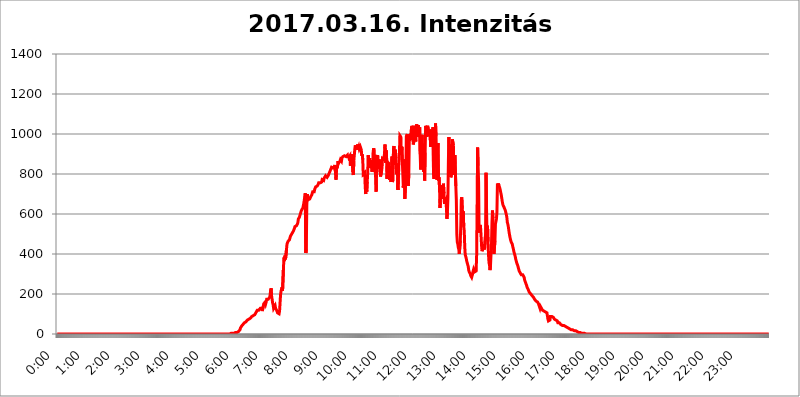
| Category | 2017.03.16. Intenzitás [W/m^2] |
|---|---|
| 0.0 | 0 |
| 0.0006944444444444445 | 0 |
| 0.001388888888888889 | 0 |
| 0.0020833333333333333 | 0 |
| 0.002777777777777778 | 0 |
| 0.003472222222222222 | 0 |
| 0.004166666666666667 | 0 |
| 0.004861111111111111 | 0 |
| 0.005555555555555556 | 0 |
| 0.0062499999999999995 | 0 |
| 0.006944444444444444 | 0 |
| 0.007638888888888889 | 0 |
| 0.008333333333333333 | 0 |
| 0.009027777777777779 | 0 |
| 0.009722222222222222 | 0 |
| 0.010416666666666666 | 0 |
| 0.011111111111111112 | 0 |
| 0.011805555555555555 | 0 |
| 0.012499999999999999 | 0 |
| 0.013194444444444444 | 0 |
| 0.013888888888888888 | 0 |
| 0.014583333333333332 | 0 |
| 0.015277777777777777 | 0 |
| 0.015972222222222224 | 0 |
| 0.016666666666666666 | 0 |
| 0.017361111111111112 | 0 |
| 0.018055555555555557 | 0 |
| 0.01875 | 0 |
| 0.019444444444444445 | 0 |
| 0.02013888888888889 | 0 |
| 0.020833333333333332 | 0 |
| 0.02152777777777778 | 0 |
| 0.022222222222222223 | 0 |
| 0.02291666666666667 | 0 |
| 0.02361111111111111 | 0 |
| 0.024305555555555556 | 0 |
| 0.024999999999999998 | 0 |
| 0.025694444444444447 | 0 |
| 0.02638888888888889 | 0 |
| 0.027083333333333334 | 0 |
| 0.027777777777777776 | 0 |
| 0.02847222222222222 | 0 |
| 0.029166666666666664 | 0 |
| 0.029861111111111113 | 0 |
| 0.030555555555555555 | 0 |
| 0.03125 | 0 |
| 0.03194444444444445 | 0 |
| 0.03263888888888889 | 0 |
| 0.03333333333333333 | 0 |
| 0.034027777777777775 | 0 |
| 0.034722222222222224 | 0 |
| 0.035416666666666666 | 0 |
| 0.036111111111111115 | 0 |
| 0.03680555555555556 | 0 |
| 0.0375 | 0 |
| 0.03819444444444444 | 0 |
| 0.03888888888888889 | 0 |
| 0.03958333333333333 | 0 |
| 0.04027777777777778 | 0 |
| 0.04097222222222222 | 0 |
| 0.041666666666666664 | 0 |
| 0.042361111111111106 | 0 |
| 0.04305555555555556 | 0 |
| 0.043750000000000004 | 0 |
| 0.044444444444444446 | 0 |
| 0.04513888888888889 | 0 |
| 0.04583333333333334 | 0 |
| 0.04652777777777778 | 0 |
| 0.04722222222222222 | 0 |
| 0.04791666666666666 | 0 |
| 0.04861111111111111 | 0 |
| 0.049305555555555554 | 0 |
| 0.049999999999999996 | 0 |
| 0.05069444444444445 | 0 |
| 0.051388888888888894 | 0 |
| 0.052083333333333336 | 0 |
| 0.05277777777777778 | 0 |
| 0.05347222222222222 | 0 |
| 0.05416666666666667 | 0 |
| 0.05486111111111111 | 0 |
| 0.05555555555555555 | 0 |
| 0.05625 | 0 |
| 0.05694444444444444 | 0 |
| 0.057638888888888885 | 0 |
| 0.05833333333333333 | 0 |
| 0.05902777777777778 | 0 |
| 0.059722222222222225 | 0 |
| 0.06041666666666667 | 0 |
| 0.061111111111111116 | 0 |
| 0.06180555555555556 | 0 |
| 0.0625 | 0 |
| 0.06319444444444444 | 0 |
| 0.06388888888888888 | 0 |
| 0.06458333333333334 | 0 |
| 0.06527777777777778 | 0 |
| 0.06597222222222222 | 0 |
| 0.06666666666666667 | 0 |
| 0.06736111111111111 | 0 |
| 0.06805555555555555 | 0 |
| 0.06874999999999999 | 0 |
| 0.06944444444444443 | 0 |
| 0.07013888888888889 | 0 |
| 0.07083333333333333 | 0 |
| 0.07152777777777779 | 0 |
| 0.07222222222222223 | 0 |
| 0.07291666666666667 | 0 |
| 0.07361111111111111 | 0 |
| 0.07430555555555556 | 0 |
| 0.075 | 0 |
| 0.07569444444444444 | 0 |
| 0.0763888888888889 | 0 |
| 0.07708333333333334 | 0 |
| 0.07777777777777778 | 0 |
| 0.07847222222222222 | 0 |
| 0.07916666666666666 | 0 |
| 0.0798611111111111 | 0 |
| 0.08055555555555556 | 0 |
| 0.08125 | 0 |
| 0.08194444444444444 | 0 |
| 0.08263888888888889 | 0 |
| 0.08333333333333333 | 0 |
| 0.08402777777777777 | 0 |
| 0.08472222222222221 | 0 |
| 0.08541666666666665 | 0 |
| 0.08611111111111112 | 0 |
| 0.08680555555555557 | 0 |
| 0.08750000000000001 | 0 |
| 0.08819444444444445 | 0 |
| 0.08888888888888889 | 0 |
| 0.08958333333333333 | 0 |
| 0.09027777777777778 | 0 |
| 0.09097222222222222 | 0 |
| 0.09166666666666667 | 0 |
| 0.09236111111111112 | 0 |
| 0.09305555555555556 | 0 |
| 0.09375 | 0 |
| 0.09444444444444444 | 0 |
| 0.09513888888888888 | 0 |
| 0.09583333333333333 | 0 |
| 0.09652777777777777 | 0 |
| 0.09722222222222222 | 0 |
| 0.09791666666666667 | 0 |
| 0.09861111111111111 | 0 |
| 0.09930555555555555 | 0 |
| 0.09999999999999999 | 0 |
| 0.10069444444444443 | 0 |
| 0.1013888888888889 | 0 |
| 0.10208333333333335 | 0 |
| 0.10277777777777779 | 0 |
| 0.10347222222222223 | 0 |
| 0.10416666666666667 | 0 |
| 0.10486111111111111 | 0 |
| 0.10555555555555556 | 0 |
| 0.10625 | 0 |
| 0.10694444444444444 | 0 |
| 0.1076388888888889 | 0 |
| 0.10833333333333334 | 0 |
| 0.10902777777777778 | 0 |
| 0.10972222222222222 | 0 |
| 0.1111111111111111 | 0 |
| 0.11180555555555556 | 0 |
| 0.11180555555555556 | 0 |
| 0.1125 | 0 |
| 0.11319444444444444 | 0 |
| 0.11388888888888889 | 0 |
| 0.11458333333333333 | 0 |
| 0.11527777777777777 | 0 |
| 0.11597222222222221 | 0 |
| 0.11666666666666665 | 0 |
| 0.1173611111111111 | 0 |
| 0.11805555555555557 | 0 |
| 0.11944444444444445 | 0 |
| 0.12013888888888889 | 0 |
| 0.12083333333333333 | 0 |
| 0.12152777777777778 | 0 |
| 0.12222222222222223 | 0 |
| 0.12291666666666667 | 0 |
| 0.12291666666666667 | 0 |
| 0.12361111111111112 | 0 |
| 0.12430555555555556 | 0 |
| 0.125 | 0 |
| 0.12569444444444444 | 0 |
| 0.12638888888888888 | 0 |
| 0.12708333333333333 | 0 |
| 0.16875 | 0 |
| 0.12847222222222224 | 0 |
| 0.12916666666666668 | 0 |
| 0.12986111111111112 | 0 |
| 0.13055555555555556 | 0 |
| 0.13125 | 0 |
| 0.13194444444444445 | 0 |
| 0.1326388888888889 | 0 |
| 0.13333333333333333 | 0 |
| 0.13402777777777777 | 0 |
| 0.13402777777777777 | 0 |
| 0.13472222222222222 | 0 |
| 0.13541666666666666 | 0 |
| 0.1361111111111111 | 0 |
| 0.13749999999999998 | 0 |
| 0.13819444444444443 | 0 |
| 0.1388888888888889 | 0 |
| 0.13958333333333334 | 0 |
| 0.14027777777777778 | 0 |
| 0.14097222222222222 | 0 |
| 0.14166666666666666 | 0 |
| 0.1423611111111111 | 0 |
| 0.14305555555555557 | 0 |
| 0.14375000000000002 | 0 |
| 0.14444444444444446 | 0 |
| 0.1451388888888889 | 0 |
| 0.1451388888888889 | 0 |
| 0.14652777777777778 | 0 |
| 0.14722222222222223 | 0 |
| 0.14791666666666667 | 0 |
| 0.1486111111111111 | 0 |
| 0.14930555555555555 | 0 |
| 0.15 | 0 |
| 0.15069444444444444 | 0 |
| 0.15138888888888888 | 0 |
| 0.15208333333333332 | 0 |
| 0.15277777777777776 | 0 |
| 0.15347222222222223 | 0 |
| 0.15416666666666667 | 0 |
| 0.15486111111111112 | 0 |
| 0.15555555555555556 | 0 |
| 0.15625 | 0 |
| 0.15694444444444444 | 0 |
| 0.15763888888888888 | 0 |
| 0.15833333333333333 | 0 |
| 0.15902777777777777 | 0 |
| 0.15972222222222224 | 0 |
| 0.16041666666666668 | 0 |
| 0.16111111111111112 | 0 |
| 0.16180555555555556 | 0 |
| 0.1625 | 0 |
| 0.16319444444444445 | 0 |
| 0.1638888888888889 | 0 |
| 0.16458333333333333 | 0 |
| 0.16527777777777777 | 0 |
| 0.16597222222222222 | 0 |
| 0.16666666666666666 | 0 |
| 0.1673611111111111 | 0 |
| 0.16805555555555554 | 0 |
| 0.16874999999999998 | 0 |
| 0.16944444444444443 | 0 |
| 0.17013888888888887 | 0 |
| 0.1708333333333333 | 0 |
| 0.17152777777777775 | 0 |
| 0.17222222222222225 | 0 |
| 0.1729166666666667 | 0 |
| 0.17361111111111113 | 0 |
| 0.17430555555555557 | 0 |
| 0.17500000000000002 | 0 |
| 0.17569444444444446 | 0 |
| 0.1763888888888889 | 0 |
| 0.17708333333333334 | 0 |
| 0.17777777777777778 | 0 |
| 0.17847222222222223 | 0 |
| 0.17916666666666667 | 0 |
| 0.1798611111111111 | 0 |
| 0.18055555555555555 | 0 |
| 0.18125 | 0 |
| 0.18194444444444444 | 0 |
| 0.1826388888888889 | 0 |
| 0.18333333333333335 | 0 |
| 0.1840277777777778 | 0 |
| 0.18472222222222223 | 0 |
| 0.18541666666666667 | 0 |
| 0.18611111111111112 | 0 |
| 0.18680555555555556 | 0 |
| 0.1875 | 0 |
| 0.18819444444444444 | 0 |
| 0.18888888888888888 | 0 |
| 0.18958333333333333 | 0 |
| 0.19027777777777777 | 0 |
| 0.1909722222222222 | 0 |
| 0.19166666666666665 | 0 |
| 0.19236111111111112 | 0 |
| 0.19305555555555554 | 0 |
| 0.19375 | 0 |
| 0.19444444444444445 | 0 |
| 0.1951388888888889 | 0 |
| 0.19583333333333333 | 0 |
| 0.19652777777777777 | 0 |
| 0.19722222222222222 | 0 |
| 0.19791666666666666 | 0 |
| 0.1986111111111111 | 0 |
| 0.19930555555555554 | 0 |
| 0.19999999999999998 | 0 |
| 0.20069444444444443 | 0 |
| 0.20138888888888887 | 0 |
| 0.2020833333333333 | 0 |
| 0.2027777777777778 | 0 |
| 0.2034722222222222 | 0 |
| 0.2041666666666667 | 0 |
| 0.20486111111111113 | 0 |
| 0.20555555555555557 | 0 |
| 0.20625000000000002 | 0 |
| 0.20694444444444446 | 0 |
| 0.2076388888888889 | 0 |
| 0.20833333333333334 | 0 |
| 0.20902777777777778 | 0 |
| 0.20972222222222223 | 0 |
| 0.21041666666666667 | 0 |
| 0.2111111111111111 | 0 |
| 0.21180555555555555 | 0 |
| 0.2125 | 0 |
| 0.21319444444444444 | 0 |
| 0.2138888888888889 | 0 |
| 0.21458333333333335 | 0 |
| 0.2152777777777778 | 0 |
| 0.21597222222222223 | 0 |
| 0.21666666666666667 | 0 |
| 0.21736111111111112 | 0 |
| 0.21805555555555556 | 0 |
| 0.21875 | 0 |
| 0.21944444444444444 | 0 |
| 0.22013888888888888 | 0 |
| 0.22083333333333333 | 0 |
| 0.22152777777777777 | 0 |
| 0.2222222222222222 | 0 |
| 0.22291666666666665 | 0 |
| 0.2236111111111111 | 0 |
| 0.22430555555555556 | 0 |
| 0.225 | 0 |
| 0.22569444444444445 | 0 |
| 0.2263888888888889 | 0 |
| 0.22708333333333333 | 0 |
| 0.22777777777777777 | 0 |
| 0.22847222222222222 | 0 |
| 0.22916666666666666 | 0 |
| 0.2298611111111111 | 0 |
| 0.23055555555555554 | 0 |
| 0.23124999999999998 | 0 |
| 0.23194444444444443 | 0 |
| 0.23263888888888887 | 0 |
| 0.2333333333333333 | 0 |
| 0.2340277777777778 | 0 |
| 0.2347222222222222 | 0 |
| 0.2354166666666667 | 0 |
| 0.23611111111111113 | 0 |
| 0.23680555555555557 | 0 |
| 0.23750000000000002 | 0 |
| 0.23819444444444446 | 0 |
| 0.2388888888888889 | 0 |
| 0.23958333333333334 | 0 |
| 0.24027777777777778 | 0 |
| 0.24097222222222223 | 0 |
| 0.24166666666666667 | 0 |
| 0.2423611111111111 | 0 |
| 0.24305555555555555 | 0 |
| 0.24375 | 3.525 |
| 0.24444444444444446 | 3.525 |
| 0.24513888888888888 | 3.525 |
| 0.24583333333333335 | 3.525 |
| 0.2465277777777778 | 3.525 |
| 0.24722222222222223 | 3.525 |
| 0.24791666666666667 | 3.525 |
| 0.24861111111111112 | 3.525 |
| 0.24930555555555556 | 3.525 |
| 0.25 | 7.887 |
| 0.25069444444444444 | 7.887 |
| 0.2513888888888889 | 7.887 |
| 0.2520833333333333 | 7.887 |
| 0.25277777777777777 | 7.887 |
| 0.2534722222222222 | 12.257 |
| 0.25416666666666665 | 12.257 |
| 0.2548611111111111 | 12.257 |
| 0.2555555555555556 | 16.636 |
| 0.25625000000000003 | 21.024 |
| 0.2569444444444445 | 29.823 |
| 0.2576388888888889 | 34.234 |
| 0.25833333333333336 | 38.653 |
| 0.2590277777777778 | 43.079 |
| 0.25972222222222224 | 43.079 |
| 0.2604166666666667 | 47.511 |
| 0.2611111111111111 | 47.511 |
| 0.26180555555555557 | 51.951 |
| 0.2625 | 56.398 |
| 0.26319444444444445 | 56.398 |
| 0.2638888888888889 | 60.85 |
| 0.26458333333333334 | 60.85 |
| 0.2652777777777778 | 65.31 |
| 0.2659722222222222 | 65.31 |
| 0.26666666666666666 | 69.775 |
| 0.2673611111111111 | 69.775 |
| 0.26805555555555555 | 69.775 |
| 0.26875 | 74.246 |
| 0.26944444444444443 | 74.246 |
| 0.2701388888888889 | 74.246 |
| 0.2708333333333333 | 78.722 |
| 0.27152777777777776 | 83.205 |
| 0.2722222222222222 | 83.205 |
| 0.27291666666666664 | 87.692 |
| 0.2736111111111111 | 87.692 |
| 0.2743055555555555 | 87.692 |
| 0.27499999999999997 | 92.184 |
| 0.27569444444444446 | 92.184 |
| 0.27638888888888885 | 92.184 |
| 0.27708333333333335 | 96.682 |
| 0.2777777777777778 | 101.184 |
| 0.27847222222222223 | 105.69 |
| 0.2791666666666667 | 110.201 |
| 0.2798611111111111 | 110.201 |
| 0.28055555555555556 | 119.235 |
| 0.28125 | 119.235 |
| 0.28194444444444444 | 119.235 |
| 0.2826388888888889 | 119.235 |
| 0.2833333333333333 | 123.758 |
| 0.28402777777777777 | 123.758 |
| 0.2847222222222222 | 128.284 |
| 0.28541666666666665 | 128.284 |
| 0.28611111111111115 | 132.814 |
| 0.28680555555555554 | 128.284 |
| 0.28750000000000003 | 114.716 |
| 0.2881944444444445 | 114.716 |
| 0.2888888888888889 | 137.347 |
| 0.28958333333333336 | 150.964 |
| 0.2902777777777778 | 150.964 |
| 0.29097222222222224 | 146.423 |
| 0.2916666666666667 | 160.056 |
| 0.2923611111111111 | 150.964 |
| 0.29305555555555557 | 160.056 |
| 0.29375 | 173.709 |
| 0.29444444444444445 | 178.264 |
| 0.2951388888888889 | 173.709 |
| 0.29583333333333334 | 173.709 |
| 0.2965277777777778 | 178.264 |
| 0.2972222222222222 | 178.264 |
| 0.29791666666666666 | 182.82 |
| 0.2986111111111111 | 196.497 |
| 0.29930555555555555 | 219.309 |
| 0.3 | 228.436 |
| 0.30069444444444443 | 187.378 |
| 0.3013888888888889 | 173.709 |
| 0.3020833333333333 | 155.509 |
| 0.30277777777777776 | 146.423 |
| 0.3034722222222222 | 128.284 |
| 0.30416666666666664 | 128.284 |
| 0.3048611111111111 | 132.814 |
| 0.3055555555555555 | 141.884 |
| 0.30624999999999997 | 128.284 |
| 0.3069444444444444 | 132.814 |
| 0.3076388888888889 | 119.235 |
| 0.30833333333333335 | 114.716 |
| 0.3090277777777778 | 105.69 |
| 0.30972222222222223 | 101.184 |
| 0.3104166666666667 | 101.184 |
| 0.3111111111111111 | 101.184 |
| 0.31180555555555556 | 114.716 |
| 0.3125 | 119.235 |
| 0.31319444444444444 | 196.497 |
| 0.3138888888888889 | 214.746 |
| 0.3145833333333333 | 214.746 |
| 0.31527777777777777 | 233 |
| 0.3159722222222222 | 214.746 |
| 0.31666666666666665 | 210.182 |
| 0.31736111111111115 | 337.639 |
| 0.31805555555555554 | 382.715 |
| 0.31875000000000003 | 364.728 |
| 0.3194444444444445 | 391.685 |
| 0.3201388888888889 | 373.729 |
| 0.32083333333333336 | 378.224 |
| 0.3215277777777778 | 422.943 |
| 0.32222222222222224 | 449.551 |
| 0.3229166666666667 | 453.968 |
| 0.3236111111111111 | 462.786 |
| 0.32430555555555557 | 462.786 |
| 0.325 | 462.786 |
| 0.32569444444444445 | 471.582 |
| 0.3263888888888889 | 480.356 |
| 0.32708333333333334 | 489.108 |
| 0.3277777777777778 | 484.735 |
| 0.3284722222222222 | 497.836 |
| 0.32916666666666666 | 497.836 |
| 0.3298611111111111 | 506.542 |
| 0.33055555555555555 | 510.885 |
| 0.33125 | 515.223 |
| 0.33194444444444443 | 519.555 |
| 0.3326388888888889 | 528.2 |
| 0.3333333333333333 | 536.82 |
| 0.3340277777777778 | 532.513 |
| 0.3347222222222222 | 541.121 |
| 0.3354166666666667 | 541.121 |
| 0.3361111111111111 | 545.416 |
| 0.3368055555555556 | 549.704 |
| 0.33749999999999997 | 558.261 |
| 0.33819444444444446 | 575.299 |
| 0.33888888888888885 | 579.542 |
| 0.33958333333333335 | 583.779 |
| 0.34027777777777773 | 592.233 |
| 0.34097222222222223 | 600.661 |
| 0.3416666666666666 | 609.062 |
| 0.3423611111111111 | 617.436 |
| 0.3430555555555555 | 617.436 |
| 0.34375 | 617.436 |
| 0.3444444444444445 | 629.948 |
| 0.3451388888888889 | 634.105 |
| 0.3458333333333334 | 654.791 |
| 0.34652777777777777 | 671.22 |
| 0.34722222222222227 | 687.544 |
| 0.34791666666666665 | 703.762 |
| 0.34861111111111115 | 405.108 |
| 0.34930555555555554 | 422.943 |
| 0.35000000000000003 | 642.4 |
| 0.3506944444444444 | 699.717 |
| 0.3513888888888889 | 679.395 |
| 0.3520833333333333 | 671.22 |
| 0.3527777777777778 | 667.123 |
| 0.3534722222222222 | 675.311 |
| 0.3541666666666667 | 675.311 |
| 0.3548611111111111 | 679.395 |
| 0.35555555555555557 | 687.544 |
| 0.35625 | 691.608 |
| 0.35694444444444445 | 695.666 |
| 0.3576388888888889 | 699.717 |
| 0.35833333333333334 | 711.832 |
| 0.3590277777777778 | 715.858 |
| 0.3597222222222222 | 715.858 |
| 0.36041666666666666 | 711.832 |
| 0.3611111111111111 | 723.889 |
| 0.36180555555555555 | 727.896 |
| 0.3625 | 735.89 |
| 0.36319444444444443 | 735.89 |
| 0.3638888888888889 | 735.89 |
| 0.3645833333333333 | 739.877 |
| 0.3652777777777778 | 739.877 |
| 0.3659722222222222 | 747.834 |
| 0.3666666666666667 | 755.766 |
| 0.3673611111111111 | 759.723 |
| 0.3680555555555556 | 759.723 |
| 0.36874999999999997 | 755.766 |
| 0.36944444444444446 | 751.803 |
| 0.37013888888888885 | 755.766 |
| 0.37083333333333335 | 759.723 |
| 0.37152777777777773 | 771.559 |
| 0.37222222222222223 | 771.559 |
| 0.3729166666666666 | 771.559 |
| 0.3736111111111111 | 767.62 |
| 0.3743055555555555 | 779.42 |
| 0.375 | 779.42 |
| 0.3756944444444445 | 783.342 |
| 0.3763888888888889 | 791.169 |
| 0.3770833333333334 | 791.169 |
| 0.37777777777777777 | 791.169 |
| 0.37847222222222227 | 783.342 |
| 0.37916666666666665 | 787.258 |
| 0.37986111111111115 | 791.169 |
| 0.38055555555555554 | 795.074 |
| 0.38125000000000003 | 802.868 |
| 0.3819444444444444 | 802.868 |
| 0.3826388888888889 | 814.519 |
| 0.3833333333333333 | 814.519 |
| 0.3840277777777778 | 810.641 |
| 0.3847222222222222 | 833.834 |
| 0.3854166666666667 | 833.834 |
| 0.3861111111111111 | 837.682 |
| 0.38680555555555557 | 829.981 |
| 0.3875 | 833.834 |
| 0.38819444444444445 | 829.981 |
| 0.3888888888888889 | 837.682 |
| 0.38958333333333334 | 845.365 |
| 0.3902777777777778 | 802.868 |
| 0.3909722222222222 | 771.559 |
| 0.39166666666666666 | 826.123 |
| 0.3923611111111111 | 829.981 |
| 0.39305555555555555 | 833.834 |
| 0.39375 | 864.493 |
| 0.39444444444444443 | 853.029 |
| 0.3951388888888889 | 856.855 |
| 0.3958333333333333 | 856.855 |
| 0.3965277777777778 | 864.493 |
| 0.3972222222222222 | 872.114 |
| 0.3979166666666667 | 868.305 |
| 0.3986111111111111 | 864.493 |
| 0.3993055555555556 | 879.719 |
| 0.39999999999999997 | 883.516 |
| 0.40069444444444446 | 887.309 |
| 0.40138888888888885 | 891.099 |
| 0.40208333333333335 | 891.099 |
| 0.40277777777777773 | 891.099 |
| 0.40347222222222223 | 887.309 |
| 0.4041666666666666 | 891.099 |
| 0.4048611111111111 | 887.309 |
| 0.4055555555555555 | 887.309 |
| 0.40625 | 891.099 |
| 0.4069444444444445 | 894.885 |
| 0.4076388888888889 | 879.719 |
| 0.4083333333333334 | 894.885 |
| 0.40902777777777777 | 883.516 |
| 0.40972222222222227 | 887.309 |
| 0.41041666666666665 | 891.099 |
| 0.41111111111111115 | 841.526 |
| 0.41180555555555554 | 875.918 |
| 0.41250000000000003 | 887.309 |
| 0.4131944444444444 | 898.668 |
| 0.4138888888888889 | 898.668 |
| 0.4145833333333333 | 810.641 |
| 0.4152777777777778 | 795.074 |
| 0.4159722222222222 | 868.305 |
| 0.4166666666666667 | 894.885 |
| 0.4173611111111111 | 925.06 |
| 0.41805555555555557 | 943.832 |
| 0.41875 | 947.58 |
| 0.41944444444444445 | 928.819 |
| 0.4201388888888889 | 921.298 |
| 0.42083333333333334 | 925.06 |
| 0.4215277777777778 | 947.58 |
| 0.4222222222222222 | 928.819 |
| 0.42291666666666666 | 936.33 |
| 0.4236111111111111 | 925.06 |
| 0.42430555555555555 | 921.298 |
| 0.425 | 936.33 |
| 0.42569444444444443 | 940.082 |
| 0.4263888888888889 | 921.298 |
| 0.4270833333333333 | 891.099 |
| 0.4277777777777778 | 898.668 |
| 0.4284722222222222 | 872.114 |
| 0.4291666666666667 | 798.974 |
| 0.4298611111111111 | 795.074 |
| 0.4305555555555556 | 798.974 |
| 0.43124999999999997 | 806.757 |
| 0.43194444444444446 | 735.89 |
| 0.43263888888888885 | 699.717 |
| 0.43333333333333335 | 763.674 |
| 0.43402777777777773 | 711.832 |
| 0.43472222222222223 | 759.723 |
| 0.4354166666666666 | 802.868 |
| 0.4361111111111111 | 894.885 |
| 0.4368055555555555 | 864.493 |
| 0.4375 | 853.029 |
| 0.4381944444444445 | 879.719 |
| 0.4388888888888889 | 849.199 |
| 0.4395833333333334 | 829.981 |
| 0.44027777777777777 | 868.305 |
| 0.44097222222222227 | 868.305 |
| 0.44166666666666665 | 810.641 |
| 0.44236111111111115 | 833.834 |
| 0.44305555555555554 | 909.996 |
| 0.44375000000000003 | 928.819 |
| 0.4444444444444444 | 913.766 |
| 0.4451388888888889 | 879.719 |
| 0.4458333333333333 | 826.123 |
| 0.4465277777777778 | 783.342 |
| 0.4472222222222222 | 711.832 |
| 0.4479166666666667 | 845.365 |
| 0.4486111111111111 | 887.309 |
| 0.44930555555555557 | 894.885 |
| 0.45 | 845.365 |
| 0.45069444444444445 | 826.123 |
| 0.4513888888888889 | 826.123 |
| 0.45208333333333334 | 872.114 |
| 0.4527777777777778 | 810.641 |
| 0.4534722222222222 | 787.258 |
| 0.45416666666666666 | 787.258 |
| 0.4548611111111111 | 814.519 |
| 0.45555555555555555 | 833.834 |
| 0.45625 | 879.719 |
| 0.45694444444444443 | 875.918 |
| 0.4576388888888889 | 875.918 |
| 0.4583333333333333 | 875.918 |
| 0.4590277777777778 | 906.223 |
| 0.4597222222222222 | 947.58 |
| 0.4604166666666667 | 856.855 |
| 0.4611111111111111 | 917.534 |
| 0.4618055555555556 | 909.996 |
| 0.46249999999999997 | 775.492 |
| 0.46319444444444446 | 860.676 |
| 0.46388888888888885 | 860.676 |
| 0.46458333333333335 | 856.855 |
| 0.46527777777777773 | 853.029 |
| 0.46597222222222223 | 771.559 |
| 0.4666666666666666 | 814.519 |
| 0.4673611111111111 | 798.974 |
| 0.4680555555555555 | 759.723 |
| 0.46875 | 818.392 |
| 0.4694444444444445 | 887.309 |
| 0.4701388888888889 | 759.723 |
| 0.4708333333333334 | 771.559 |
| 0.47152777777777777 | 921.298 |
| 0.47222222222222227 | 940.082 |
| 0.47291666666666665 | 891.099 |
| 0.47361111111111115 | 845.365 |
| 0.47430555555555554 | 921.298 |
| 0.47500000000000003 | 879.719 |
| 0.4756944444444444 | 798.974 |
| 0.4763888888888889 | 841.526 |
| 0.4770833333333333 | 853.029 |
| 0.4777777777777778 | 719.877 |
| 0.4784722222222222 | 783.342 |
| 0.4791666666666667 | 845.365 |
| 0.4798611111111111 | 894.885 |
| 0.48055555555555557 | 992.448 |
| 0.48125 | 988.714 |
| 0.48194444444444445 | 984.98 |
| 0.4826388888888889 | 898.668 |
| 0.48333333333333334 | 936.33 |
| 0.4840277777777778 | 860.676 |
| 0.4847222222222222 | 860.676 |
| 0.48541666666666666 | 731.896 |
| 0.4861111111111111 | 872.114 |
| 0.48680555555555555 | 775.492 |
| 0.4875 | 675.311 |
| 0.48819444444444443 | 675.311 |
| 0.4888888888888889 | 775.492 |
| 0.4895833333333333 | 988.714 |
| 0.4902777777777778 | 988.714 |
| 0.4909722222222222 | 999.916 |
| 0.4916666666666667 | 925.06 |
| 0.4923611111111111 | 739.877 |
| 0.4930555555555556 | 798.974 |
| 0.49374999999999997 | 973.772 |
| 0.49444444444444446 | 966.295 |
| 0.49513888888888885 | 999.916 |
| 0.49583333333333335 | 970.034 |
| 0.49652777777777773 | 1018.587 |
| 0.49722222222222223 | 1041.019 |
| 0.4979166666666666 | 1033.537 |
| 0.4986111111111111 | 996.182 |
| 0.4993055555555555 | 947.58 |
| 0.5 | 958.814 |
| 0.5006944444444444 | 1029.798 |
| 0.5013888888888889 | 1041.019 |
| 0.5020833333333333 | 1007.383 |
| 0.5027777777777778 | 962.555 |
| 0.5034722222222222 | 1037.277 |
| 0.5041666666666667 | 1048.508 |
| 0.5048611111111111 | 1052.255 |
| 0.5055555555555555 | 992.448 |
| 0.50625 | 1044.762 |
| 0.5069444444444444 | 984.98 |
| 0.5076388888888889 | 1018.587 |
| 0.5083333333333333 | 1033.537 |
| 0.5090277777777777 | 898.668 |
| 0.5097222222222222 | 822.26 |
| 0.5104166666666666 | 943.832 |
| 0.5111111111111112 | 977.508 |
| 0.5118055555555555 | 996.182 |
| 0.5125000000000001 | 891.099 |
| 0.5131944444444444 | 951.327 |
| 0.513888888888889 | 810.641 |
| 0.5145833333333333 | 887.309 |
| 0.5152777777777778 | 767.62 |
| 0.5159722222222222 | 906.223 |
| 0.5166666666666667 | 1041.019 |
| 0.517361111111111 | 1029.798 |
| 0.5180555555555556 | 984.98 |
| 0.5187499999999999 | 1029.798 |
| 0.5194444444444445 | 1041.019 |
| 0.5201388888888888 | 1037.277 |
| 0.5208333333333334 | 1014.852 |
| 0.5215277777777778 | 1011.118 |
| 0.5222222222222223 | 988.714 |
| 0.5229166666666667 | 1014.852 |
| 0.5236111111111111 | 936.33 |
| 0.5243055555555556 | 1014.852 |
| 0.525 | 1022.323 |
| 0.5256944444444445 | 984.98 |
| 0.5263888888888889 | 962.555 |
| 0.5270833333333333 | 1033.537 |
| 0.5277777777777778 | 798.974 |
| 0.5284722222222222 | 775.492 |
| 0.5291666666666667 | 928.819 |
| 0.5298611111111111 | 833.834 |
| 0.5305555555555556 | 1052.255 |
| 0.53125 | 988.714 |
| 0.5319444444444444 | 887.309 |
| 0.5326388888888889 | 771.559 |
| 0.5333333333333333 | 917.534 |
| 0.5340277777777778 | 955.071 |
| 0.5347222222222222 | 767.62 |
| 0.5354166666666667 | 783.342 |
| 0.5361111111111111 | 735.89 |
| 0.5368055555555555 | 629.948 |
| 0.5375 | 629.948 |
| 0.5381944444444444 | 743.859 |
| 0.5388888888888889 | 679.395 |
| 0.5395833333333333 | 699.717 |
| 0.5402777777777777 | 675.311 |
| 0.5409722222222222 | 719.877 |
| 0.5416666666666666 | 751.803 |
| 0.5423611111111112 | 703.762 |
| 0.5430555555555555 | 650.667 |
| 0.5437500000000001 | 667.123 |
| 0.5444444444444444 | 663.019 |
| 0.545138888888889 | 675.311 |
| 0.5458333333333333 | 629.948 |
| 0.5465277777777778 | 575.299 |
| 0.5472222222222222 | 609.062 |
| 0.5479166666666667 | 679.395 |
| 0.548611111111111 | 868.305 |
| 0.5493055555555556 | 984.98 |
| 0.5499999999999999 | 798.974 |
| 0.5506944444444445 | 947.58 |
| 0.5513888888888888 | 909.996 |
| 0.5520833333333334 | 783.342 |
| 0.5527777777777778 | 795.074 |
| 0.5534722222222223 | 917.534 |
| 0.5541666666666667 | 973.772 |
| 0.5548611111111111 | 973.772 |
| 0.5555555555555556 | 943.832 |
| 0.55625 | 829.981 |
| 0.5569444444444445 | 795.074 |
| 0.5576388888888889 | 894.885 |
| 0.5583333333333333 | 894.885 |
| 0.5590277777777778 | 739.877 |
| 0.5597222222222222 | 671.22 |
| 0.5604166666666667 | 497.836 |
| 0.5611111111111111 | 458.38 |
| 0.5618055555555556 | 449.551 |
| 0.5625 | 431.833 |
| 0.5631944444444444 | 422.943 |
| 0.5638888888888889 | 400.638 |
| 0.5645833333333333 | 400.638 |
| 0.5652777777777778 | 467.187 |
| 0.5659722222222222 | 541.121 |
| 0.5666666666666667 | 671.22 |
| 0.5673611111111111 | 683.473 |
| 0.5680555555555555 | 625.784 |
| 0.56875 | 604.864 |
| 0.5694444444444444 | 613.252 |
| 0.5701388888888889 | 536.82 |
| 0.5708333333333333 | 515.223 |
| 0.5715277777777777 | 436.27 |
| 0.5722222222222222 | 396.164 |
| 0.5729166666666666 | 387.202 |
| 0.5736111111111112 | 378.224 |
| 0.5743055555555555 | 364.728 |
| 0.5750000000000001 | 355.712 |
| 0.5756944444444444 | 346.682 |
| 0.576388888888889 | 337.639 |
| 0.5770833333333333 | 319.517 |
| 0.5777777777777778 | 310.44 |
| 0.5784722222222222 | 305.898 |
| 0.5791666666666667 | 301.354 |
| 0.579861111111111 | 292.259 |
| 0.5805555555555556 | 287.709 |
| 0.5812499999999999 | 283.156 |
| 0.5819444444444445 | 287.709 |
| 0.5826388888888888 | 301.354 |
| 0.5833333333333334 | 314.98 |
| 0.5840277777777778 | 324.052 |
| 0.5847222222222223 | 319.517 |
| 0.5854166666666667 | 310.44 |
| 0.5861111111111111 | 305.898 |
| 0.5868055555555556 | 305.898 |
| 0.5875 | 314.98 |
| 0.5881944444444445 | 391.685 |
| 0.5888888888888889 | 646.537 |
| 0.5895833333333333 | 932.576 |
| 0.5902777777777778 | 841.526 |
| 0.5909722222222222 | 759.723 |
| 0.5916666666666667 | 506.542 |
| 0.5923611111111111 | 506.542 |
| 0.5930555555555556 | 545.416 |
| 0.59375 | 532.513 |
| 0.5944444444444444 | 489.108 |
| 0.5951388888888889 | 440.702 |
| 0.5958333333333333 | 414.035 |
| 0.5965277777777778 | 422.943 |
| 0.5972222222222222 | 422.943 |
| 0.5979166666666667 | 431.833 |
| 0.5986111111111111 | 449.551 |
| 0.5993055555555555 | 422.943 |
| 0.6 | 422.943 |
| 0.6006944444444444 | 497.836 |
| 0.6013888888888889 | 806.757 |
| 0.6020833333333333 | 625.784 |
| 0.6027777777777777 | 493.475 |
| 0.6034722222222222 | 541.121 |
| 0.6041666666666666 | 462.786 |
| 0.6048611111111112 | 396.164 |
| 0.6055555555555555 | 355.712 |
| 0.6062500000000001 | 346.682 |
| 0.6069444444444444 | 319.517 |
| 0.607638888888889 | 342.162 |
| 0.6083333333333333 | 396.164 |
| 0.6090277777777778 | 445.129 |
| 0.6097222222222222 | 558.261 |
| 0.6104166666666667 | 617.436 |
| 0.611111111111111 | 579.542 |
| 0.6118055555555556 | 431.833 |
| 0.6124999999999999 | 400.638 |
| 0.6131944444444445 | 396.164 |
| 0.6138888888888888 | 467.187 |
| 0.6145833333333334 | 549.704 |
| 0.6152777777777778 | 545.416 |
| 0.6159722222222223 | 575.299 |
| 0.6166666666666667 | 609.062 |
| 0.6173611111111111 | 751.803 |
| 0.6180555555555556 | 739.877 |
| 0.61875 | 751.803 |
| 0.6194444444444445 | 743.859 |
| 0.6201388888888889 | 739.877 |
| 0.6208333333333333 | 727.896 |
| 0.6215277777777778 | 715.858 |
| 0.6222222222222222 | 703.762 |
| 0.6229166666666667 | 691.608 |
| 0.6236111111111111 | 675.311 |
| 0.6243055555555556 | 658.909 |
| 0.625 | 646.537 |
| 0.6256944444444444 | 642.4 |
| 0.6263888888888889 | 642.4 |
| 0.6270833333333333 | 629.948 |
| 0.6277777777777778 | 629.948 |
| 0.6284722222222222 | 617.436 |
| 0.6291666666666667 | 617.436 |
| 0.6298611111111111 | 596.45 |
| 0.6305555555555555 | 583.779 |
| 0.63125 | 558.261 |
| 0.6319444444444444 | 549.704 |
| 0.6326388888888889 | 536.82 |
| 0.6333333333333333 | 519.555 |
| 0.6340277777777777 | 502.192 |
| 0.6347222222222222 | 489.108 |
| 0.6354166666666666 | 475.972 |
| 0.6361111111111112 | 467.187 |
| 0.6368055555555555 | 458.38 |
| 0.6375000000000001 | 453.968 |
| 0.6381944444444444 | 449.551 |
| 0.638888888888889 | 436.27 |
| 0.6395833333333333 | 427.39 |
| 0.6402777777777778 | 414.035 |
| 0.6409722222222222 | 405.108 |
| 0.6416666666666667 | 396.164 |
| 0.642361111111111 | 387.202 |
| 0.6430555555555556 | 373.729 |
| 0.6437499999999999 | 369.23 |
| 0.6444444444444445 | 355.712 |
| 0.6451388888888888 | 351.198 |
| 0.6458333333333334 | 342.162 |
| 0.6465277777777778 | 333.113 |
| 0.6472222222222223 | 324.052 |
| 0.6479166666666667 | 314.98 |
| 0.6486111111111111 | 310.44 |
| 0.6493055555555556 | 305.898 |
| 0.65 | 301.354 |
| 0.6506944444444445 | 296.808 |
| 0.6513888888888889 | 301.354 |
| 0.6520833333333333 | 296.808 |
| 0.6527777777777778 | 296.808 |
| 0.6534722222222222 | 296.808 |
| 0.6541666666666667 | 292.259 |
| 0.6548611111111111 | 283.156 |
| 0.6555555555555556 | 269.49 |
| 0.65625 | 264.932 |
| 0.6569444444444444 | 255.813 |
| 0.6576388888888889 | 251.251 |
| 0.6583333333333333 | 242.127 |
| 0.6590277777777778 | 233 |
| 0.6597222222222222 | 228.436 |
| 0.6604166666666667 | 223.873 |
| 0.6611111111111111 | 219.309 |
| 0.6618055555555555 | 210.182 |
| 0.6625 | 210.182 |
| 0.6631944444444444 | 205.62 |
| 0.6638888888888889 | 201.058 |
| 0.6645833333333333 | 201.058 |
| 0.6652777777777777 | 196.497 |
| 0.6659722222222222 | 191.937 |
| 0.6666666666666666 | 191.937 |
| 0.6673611111111111 | 187.378 |
| 0.6680555555555556 | 182.82 |
| 0.6687500000000001 | 178.264 |
| 0.6694444444444444 | 173.709 |
| 0.6701388888888888 | 173.709 |
| 0.6708333333333334 | 169.156 |
| 0.6715277777777778 | 164.605 |
| 0.6722222222222222 | 164.605 |
| 0.6729166666666666 | 164.605 |
| 0.6736111111111112 | 160.056 |
| 0.6743055555555556 | 155.509 |
| 0.6749999999999999 | 150.964 |
| 0.6756944444444444 | 150.964 |
| 0.6763888888888889 | 146.423 |
| 0.6770833333333334 | 128.284 |
| 0.6777777777777777 | 137.347 |
| 0.6784722222222223 | 132.814 |
| 0.6791666666666667 | 128.284 |
| 0.6798611111111111 | 123.758 |
| 0.6805555555555555 | 119.235 |
| 0.68125 | 119.235 |
| 0.6819444444444445 | 114.716 |
| 0.6826388888888889 | 114.716 |
| 0.6833333333333332 | 110.201 |
| 0.6840277777777778 | 110.201 |
| 0.6847222222222222 | 110.201 |
| 0.6854166666666667 | 110.201 |
| 0.686111111111111 | 105.69 |
| 0.6868055555555556 | 105.69 |
| 0.6875 | 101.184 |
| 0.6881944444444444 | 74.246 |
| 0.688888888888889 | 65.31 |
| 0.6895833333333333 | 65.31 |
| 0.6902777777777778 | 65.31 |
| 0.6909722222222222 | 69.775 |
| 0.6916666666666668 | 87.692 |
| 0.6923611111111111 | 87.692 |
| 0.6930555555555555 | 87.692 |
| 0.69375 | 87.692 |
| 0.6944444444444445 | 83.205 |
| 0.6951388888888889 | 83.205 |
| 0.6958333333333333 | 83.205 |
| 0.6965277777777777 | 78.722 |
| 0.6972222222222223 | 74.246 |
| 0.6979166666666666 | 69.775 |
| 0.6986111111111111 | 69.775 |
| 0.6993055555555556 | 69.775 |
| 0.7000000000000001 | 69.775 |
| 0.7006944444444444 | 65.31 |
| 0.7013888888888888 | 65.31 |
| 0.7020833333333334 | 56.398 |
| 0.7027777777777778 | 56.398 |
| 0.7034722222222222 | 56.398 |
| 0.7041666666666666 | 56.398 |
| 0.7048611111111112 | 51.951 |
| 0.7055555555555556 | 51.951 |
| 0.7062499999999999 | 47.511 |
| 0.7069444444444444 | 47.511 |
| 0.7076388888888889 | 47.511 |
| 0.7083333333333334 | 43.079 |
| 0.7090277777777777 | 43.079 |
| 0.7097222222222223 | 43.079 |
| 0.7104166666666667 | 43.079 |
| 0.7111111111111111 | 38.653 |
| 0.7118055555555555 | 38.653 |
| 0.7125 | 38.653 |
| 0.7131944444444445 | 34.234 |
| 0.7138888888888889 | 34.234 |
| 0.7145833333333332 | 34.234 |
| 0.7152777777777778 | 34.234 |
| 0.7159722222222222 | 34.234 |
| 0.7166666666666667 | 29.823 |
| 0.717361111111111 | 29.823 |
| 0.7180555555555556 | 25.419 |
| 0.71875 | 25.419 |
| 0.7194444444444444 | 21.024 |
| 0.720138888888889 | 21.024 |
| 0.7208333333333333 | 21.024 |
| 0.7215277777777778 | 21.024 |
| 0.7222222222222222 | 21.024 |
| 0.7229166666666668 | 21.024 |
| 0.7236111111111111 | 21.024 |
| 0.7243055555555555 | 16.636 |
| 0.725 | 16.636 |
| 0.7256944444444445 | 16.636 |
| 0.7263888888888889 | 16.636 |
| 0.7270833333333333 | 16.636 |
| 0.7277777777777777 | 12.257 |
| 0.7284722222222223 | 12.257 |
| 0.7291666666666666 | 12.257 |
| 0.7298611111111111 | 12.257 |
| 0.7305555555555556 | 12.257 |
| 0.7312500000000001 | 7.887 |
| 0.7319444444444444 | 7.887 |
| 0.7326388888888888 | 7.887 |
| 0.7333333333333334 | 7.887 |
| 0.7340277777777778 | 3.525 |
| 0.7347222222222222 | 3.525 |
| 0.7354166666666666 | 3.525 |
| 0.7361111111111112 | 3.525 |
| 0.7368055555555556 | 3.525 |
| 0.7374999999999999 | 3.525 |
| 0.7381944444444444 | 3.525 |
| 0.7388888888888889 | 3.525 |
| 0.7395833333333334 | 3.525 |
| 0.7402777777777777 | 0 |
| 0.7409722222222223 | 0 |
| 0.7416666666666667 | 0 |
| 0.7423611111111111 | 0 |
| 0.7430555555555555 | 0 |
| 0.74375 | 0 |
| 0.7444444444444445 | 0 |
| 0.7451388888888889 | 0 |
| 0.7458333333333332 | 0 |
| 0.7465277777777778 | 0 |
| 0.7472222222222222 | 0 |
| 0.7479166666666667 | 0 |
| 0.748611111111111 | 0 |
| 0.7493055555555556 | 0 |
| 0.75 | 0 |
| 0.7506944444444444 | 0 |
| 0.751388888888889 | 0 |
| 0.7520833333333333 | 0 |
| 0.7527777777777778 | 0 |
| 0.7534722222222222 | 0 |
| 0.7541666666666668 | 0 |
| 0.7548611111111111 | 0 |
| 0.7555555555555555 | 0 |
| 0.75625 | 0 |
| 0.7569444444444445 | 0 |
| 0.7576388888888889 | 0 |
| 0.7583333333333333 | 0 |
| 0.7590277777777777 | 0 |
| 0.7597222222222223 | 0 |
| 0.7604166666666666 | 0 |
| 0.7611111111111111 | 0 |
| 0.7618055555555556 | 0 |
| 0.7625000000000001 | 0 |
| 0.7631944444444444 | 0 |
| 0.7638888888888888 | 0 |
| 0.7645833333333334 | 0 |
| 0.7652777777777778 | 0 |
| 0.7659722222222222 | 0 |
| 0.7666666666666666 | 0 |
| 0.7673611111111112 | 0 |
| 0.7680555555555556 | 0 |
| 0.7687499999999999 | 0 |
| 0.7694444444444444 | 0 |
| 0.7701388888888889 | 0 |
| 0.7708333333333334 | 0 |
| 0.7715277777777777 | 0 |
| 0.7722222222222223 | 0 |
| 0.7729166666666667 | 0 |
| 0.7736111111111111 | 0 |
| 0.7743055555555555 | 0 |
| 0.775 | 0 |
| 0.7756944444444445 | 0 |
| 0.7763888888888889 | 0 |
| 0.7770833333333332 | 0 |
| 0.7777777777777778 | 0 |
| 0.7784722222222222 | 0 |
| 0.7791666666666667 | 0 |
| 0.779861111111111 | 0 |
| 0.7805555555555556 | 0 |
| 0.78125 | 0 |
| 0.7819444444444444 | 0 |
| 0.782638888888889 | 0 |
| 0.7833333333333333 | 0 |
| 0.7840277777777778 | 0 |
| 0.7847222222222222 | 0 |
| 0.7854166666666668 | 0 |
| 0.7861111111111111 | 0 |
| 0.7868055555555555 | 0 |
| 0.7875 | 0 |
| 0.7881944444444445 | 0 |
| 0.7888888888888889 | 0 |
| 0.7895833333333333 | 0 |
| 0.7902777777777777 | 0 |
| 0.7909722222222223 | 0 |
| 0.7916666666666666 | 0 |
| 0.7923611111111111 | 0 |
| 0.7930555555555556 | 0 |
| 0.7937500000000001 | 0 |
| 0.7944444444444444 | 0 |
| 0.7951388888888888 | 0 |
| 0.7958333333333334 | 0 |
| 0.7965277777777778 | 0 |
| 0.7972222222222222 | 0 |
| 0.7979166666666666 | 0 |
| 0.7986111111111112 | 0 |
| 0.7993055555555556 | 0 |
| 0.7999999999999999 | 0 |
| 0.8006944444444444 | 0 |
| 0.8013888888888889 | 0 |
| 0.8020833333333334 | 0 |
| 0.8027777777777777 | 0 |
| 0.8034722222222223 | 0 |
| 0.8041666666666667 | 0 |
| 0.8048611111111111 | 0 |
| 0.8055555555555555 | 0 |
| 0.80625 | 0 |
| 0.8069444444444445 | 0 |
| 0.8076388888888889 | 0 |
| 0.8083333333333332 | 0 |
| 0.8090277777777778 | 0 |
| 0.8097222222222222 | 0 |
| 0.8104166666666667 | 0 |
| 0.811111111111111 | 0 |
| 0.8118055555555556 | 0 |
| 0.8125 | 0 |
| 0.8131944444444444 | 0 |
| 0.813888888888889 | 0 |
| 0.8145833333333333 | 0 |
| 0.8152777777777778 | 0 |
| 0.8159722222222222 | 0 |
| 0.8166666666666668 | 0 |
| 0.8173611111111111 | 0 |
| 0.8180555555555555 | 0 |
| 0.81875 | 0 |
| 0.8194444444444445 | 0 |
| 0.8201388888888889 | 0 |
| 0.8208333333333333 | 0 |
| 0.8215277777777777 | 0 |
| 0.8222222222222223 | 0 |
| 0.8229166666666666 | 0 |
| 0.8236111111111111 | 0 |
| 0.8243055555555556 | 0 |
| 0.8250000000000001 | 0 |
| 0.8256944444444444 | 0 |
| 0.8263888888888888 | 0 |
| 0.8270833333333334 | 0 |
| 0.8277777777777778 | 0 |
| 0.8284722222222222 | 0 |
| 0.8291666666666666 | 0 |
| 0.8298611111111112 | 0 |
| 0.8305555555555556 | 0 |
| 0.8312499999999999 | 0 |
| 0.8319444444444444 | 0 |
| 0.8326388888888889 | 0 |
| 0.8333333333333334 | 0 |
| 0.8340277777777777 | 0 |
| 0.8347222222222223 | 0 |
| 0.8354166666666667 | 0 |
| 0.8361111111111111 | 0 |
| 0.8368055555555555 | 0 |
| 0.8375 | 0 |
| 0.8381944444444445 | 0 |
| 0.8388888888888889 | 0 |
| 0.8395833333333332 | 0 |
| 0.8402777777777778 | 0 |
| 0.8409722222222222 | 0 |
| 0.8416666666666667 | 0 |
| 0.842361111111111 | 0 |
| 0.8430555555555556 | 0 |
| 0.84375 | 0 |
| 0.8444444444444444 | 0 |
| 0.845138888888889 | 0 |
| 0.8458333333333333 | 0 |
| 0.8465277777777778 | 0 |
| 0.8472222222222222 | 0 |
| 0.8479166666666668 | 0 |
| 0.8486111111111111 | 0 |
| 0.8493055555555555 | 0 |
| 0.85 | 0 |
| 0.8506944444444445 | 0 |
| 0.8513888888888889 | 0 |
| 0.8520833333333333 | 0 |
| 0.8527777777777777 | 0 |
| 0.8534722222222223 | 0 |
| 0.8541666666666666 | 0 |
| 0.8548611111111111 | 0 |
| 0.8555555555555556 | 0 |
| 0.8562500000000001 | 0 |
| 0.8569444444444444 | 0 |
| 0.8576388888888888 | 0 |
| 0.8583333333333334 | 0 |
| 0.8590277777777778 | 0 |
| 0.8597222222222222 | 0 |
| 0.8604166666666666 | 0 |
| 0.8611111111111112 | 0 |
| 0.8618055555555556 | 0 |
| 0.8624999999999999 | 0 |
| 0.8631944444444444 | 0 |
| 0.8638888888888889 | 0 |
| 0.8645833333333334 | 0 |
| 0.8652777777777777 | 0 |
| 0.8659722222222223 | 0 |
| 0.8666666666666667 | 0 |
| 0.8673611111111111 | 0 |
| 0.8680555555555555 | 0 |
| 0.86875 | 0 |
| 0.8694444444444445 | 0 |
| 0.8701388888888889 | 0 |
| 0.8708333333333332 | 0 |
| 0.8715277777777778 | 0 |
| 0.8722222222222222 | 0 |
| 0.8729166666666667 | 0 |
| 0.873611111111111 | 0 |
| 0.8743055555555556 | 0 |
| 0.875 | 0 |
| 0.8756944444444444 | 0 |
| 0.876388888888889 | 0 |
| 0.8770833333333333 | 0 |
| 0.8777777777777778 | 0 |
| 0.8784722222222222 | 0 |
| 0.8791666666666668 | 0 |
| 0.8798611111111111 | 0 |
| 0.8805555555555555 | 0 |
| 0.88125 | 0 |
| 0.8819444444444445 | 0 |
| 0.8826388888888889 | 0 |
| 0.8833333333333333 | 0 |
| 0.8840277777777777 | 0 |
| 0.8847222222222223 | 0 |
| 0.8854166666666666 | 0 |
| 0.8861111111111111 | 0 |
| 0.8868055555555556 | 0 |
| 0.8875000000000001 | 0 |
| 0.8881944444444444 | 0 |
| 0.8888888888888888 | 0 |
| 0.8895833333333334 | 0 |
| 0.8902777777777778 | 0 |
| 0.8909722222222222 | 0 |
| 0.8916666666666666 | 0 |
| 0.8923611111111112 | 0 |
| 0.8930555555555556 | 0 |
| 0.8937499999999999 | 0 |
| 0.8944444444444444 | 0 |
| 0.8951388888888889 | 0 |
| 0.8958333333333334 | 0 |
| 0.8965277777777777 | 0 |
| 0.8972222222222223 | 0 |
| 0.8979166666666667 | 0 |
| 0.8986111111111111 | 0 |
| 0.8993055555555555 | 0 |
| 0.9 | 0 |
| 0.9006944444444445 | 0 |
| 0.9013888888888889 | 0 |
| 0.9020833333333332 | 0 |
| 0.9027777777777778 | 0 |
| 0.9034722222222222 | 0 |
| 0.9041666666666667 | 0 |
| 0.904861111111111 | 0 |
| 0.9055555555555556 | 0 |
| 0.90625 | 0 |
| 0.9069444444444444 | 0 |
| 0.907638888888889 | 0 |
| 0.9083333333333333 | 0 |
| 0.9090277777777778 | 0 |
| 0.9097222222222222 | 0 |
| 0.9104166666666668 | 0 |
| 0.9111111111111111 | 0 |
| 0.9118055555555555 | 0 |
| 0.9125 | 0 |
| 0.9131944444444445 | 0 |
| 0.9138888888888889 | 0 |
| 0.9145833333333333 | 0 |
| 0.9152777777777777 | 0 |
| 0.9159722222222223 | 0 |
| 0.9166666666666666 | 0 |
| 0.9173611111111111 | 0 |
| 0.9180555555555556 | 0 |
| 0.9187500000000001 | 0 |
| 0.9194444444444444 | 0 |
| 0.9201388888888888 | 0 |
| 0.9208333333333334 | 0 |
| 0.9215277777777778 | 0 |
| 0.9222222222222222 | 0 |
| 0.9229166666666666 | 0 |
| 0.9236111111111112 | 0 |
| 0.9243055555555556 | 0 |
| 0.9249999999999999 | 0 |
| 0.9256944444444444 | 0 |
| 0.9263888888888889 | 0 |
| 0.9270833333333334 | 0 |
| 0.9277777777777777 | 0 |
| 0.9284722222222223 | 0 |
| 0.9291666666666667 | 0 |
| 0.9298611111111111 | 0 |
| 0.9305555555555555 | 0 |
| 0.93125 | 0 |
| 0.9319444444444445 | 0 |
| 0.9326388888888889 | 0 |
| 0.9333333333333332 | 0 |
| 0.9340277777777778 | 0 |
| 0.9347222222222222 | 0 |
| 0.9354166666666667 | 0 |
| 0.936111111111111 | 0 |
| 0.9368055555555556 | 0 |
| 0.9375 | 0 |
| 0.9381944444444444 | 0 |
| 0.938888888888889 | 0 |
| 0.9395833333333333 | 0 |
| 0.9402777777777778 | 0 |
| 0.9409722222222222 | 0 |
| 0.9416666666666668 | 0 |
| 0.9423611111111111 | 0 |
| 0.9430555555555555 | 0 |
| 0.94375 | 0 |
| 0.9444444444444445 | 0 |
| 0.9451388888888889 | 0 |
| 0.9458333333333333 | 0 |
| 0.9465277777777777 | 0 |
| 0.9472222222222223 | 0 |
| 0.9479166666666666 | 0 |
| 0.9486111111111111 | 0 |
| 0.9493055555555556 | 0 |
| 0.9500000000000001 | 0 |
| 0.9506944444444444 | 0 |
| 0.9513888888888888 | 0 |
| 0.9520833333333334 | 0 |
| 0.9527777777777778 | 0 |
| 0.9534722222222222 | 0 |
| 0.9541666666666666 | 0 |
| 0.9548611111111112 | 0 |
| 0.9555555555555556 | 0 |
| 0.9562499999999999 | 0 |
| 0.9569444444444444 | 0 |
| 0.9576388888888889 | 0 |
| 0.9583333333333334 | 0 |
| 0.9590277777777777 | 0 |
| 0.9597222222222223 | 0 |
| 0.9604166666666667 | 0 |
| 0.9611111111111111 | 0 |
| 0.9618055555555555 | 0 |
| 0.9625 | 0 |
| 0.9631944444444445 | 0 |
| 0.9638888888888889 | 0 |
| 0.9645833333333332 | 0 |
| 0.9652777777777778 | 0 |
| 0.9659722222222222 | 0 |
| 0.9666666666666667 | 0 |
| 0.967361111111111 | 0 |
| 0.9680555555555556 | 0 |
| 0.96875 | 0 |
| 0.9694444444444444 | 0 |
| 0.970138888888889 | 0 |
| 0.9708333333333333 | 0 |
| 0.9715277777777778 | 0 |
| 0.9722222222222222 | 0 |
| 0.9729166666666668 | 0 |
| 0.9736111111111111 | 0 |
| 0.9743055555555555 | 0 |
| 0.975 | 0 |
| 0.9756944444444445 | 0 |
| 0.9763888888888889 | 0 |
| 0.9770833333333333 | 0 |
| 0.9777777777777777 | 0 |
| 0.9784722222222223 | 0 |
| 0.9791666666666666 | 0 |
| 0.9798611111111111 | 0 |
| 0.9805555555555556 | 0 |
| 0.9812500000000001 | 0 |
| 0.9819444444444444 | 0 |
| 0.9826388888888888 | 0 |
| 0.9833333333333334 | 0 |
| 0.9840277777777778 | 0 |
| 0.9847222222222222 | 0 |
| 0.9854166666666666 | 0 |
| 0.9861111111111112 | 0 |
| 0.9868055555555556 | 0 |
| 0.9874999999999999 | 0 |
| 0.9881944444444444 | 0 |
| 0.9888888888888889 | 0 |
| 0.9895833333333334 | 0 |
| 0.9902777777777777 | 0 |
| 0.9909722222222223 | 0 |
| 0.9916666666666667 | 0 |
| 0.9923611111111111 | 0 |
| 0.9930555555555555 | 0 |
| 0.99375 | 0 |
| 0.9944444444444445 | 0 |
| 0.9951388888888889 | 0 |
| 0.9958333333333332 | 0 |
| 0.9965277777777778 | 0 |
| 0.9972222222222222 | 0 |
| 0.9979166666666667 | 0 |
| 0.998611111111111 | 0 |
| 0.9993055555555556 | 0 |